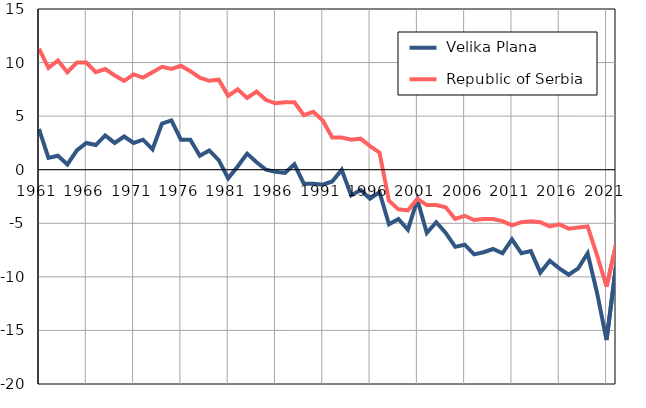
| Category |  Velika Plana |  Republic of Serbia |
|---|---|---|
| 1961.0 | 3.8 | 11.3 |
| 1962.0 | 1.1 | 9.5 |
| 1963.0 | 1.3 | 10.2 |
| 1964.0 | 0.5 | 9.1 |
| 1965.0 | 1.8 | 10 |
| 1966.0 | 2.5 | 10 |
| 1967.0 | 2.3 | 9.1 |
| 1968.0 | 3.2 | 9.4 |
| 1969.0 | 2.5 | 8.8 |
| 1970.0 | 3.1 | 8.3 |
| 1971.0 | 2.5 | 8.9 |
| 1972.0 | 2.8 | 8.6 |
| 1973.0 | 1.9 | 9.1 |
| 1974.0 | 4.3 | 9.6 |
| 1975.0 | 4.6 | 9.4 |
| 1976.0 | 2.8 | 9.7 |
| 1977.0 | 2.8 | 9.2 |
| 1978.0 | 1.3 | 8.6 |
| 1979.0 | 1.8 | 8.3 |
| 1980.0 | 0.9 | 8.4 |
| 1981.0 | -0.8 | 6.9 |
| 1982.0 | 0.3 | 7.5 |
| 1983.0 | 1.5 | 6.7 |
| 1984.0 | 0.7 | 7.3 |
| 1985.0 | 0 | 6.5 |
| 1986.0 | -0.2 | 6.2 |
| 1987.0 | -0.3 | 6.3 |
| 1988.0 | 0.5 | 6.3 |
| 1989.0 | -1.3 | 5.1 |
| 1990.0 | -1.3 | 5.4 |
| 1991.0 | -1.4 | 4.6 |
| 1992.0 | -1.1 | 3 |
| 1993.0 | 0 | 3 |
| 1994.0 | -2.4 | 2.8 |
| 1995.0 | -1.9 | 2.9 |
| 1996.0 | -2.7 | 2.2 |
| 1997.0 | -2.1 | 1.6 |
| 1998.0 | -5.1 | -2.9 |
| 1999.0 | -4.6 | -3.7 |
| 2000.0 | -5.6 | -3.8 |
| 2001.0 | -2.8 | -2.7 |
| 2002.0 | -5.9 | -3.3 |
| 2003.0 | -4.9 | -3.3 |
| 2004.0 | -5.9 | -3.5 |
| 2005.0 | -7.2 | -4.6 |
| 2006.0 | -7 | -4.3 |
| 2007.0 | -7.9 | -4.7 |
| 2008.0 | -7.7 | -4.6 |
| 2009.0 | -7.4 | -4.6 |
| 2010.0 | -7.8 | -4.8 |
| 2011.0 | -6.5 | -5.2 |
| 2012.0 | -7.8 | -4.9 |
| 2013.0 | -7.6 | -4.8 |
| 2014.0 | -9.6 | -4.9 |
| 2015.0 | -8.5 | -5.3 |
| 2016.0 | -9.2 | -5.1 |
| 2017.0 | -9.8 | -5.5 |
| 2018.0 | -9.2 | -5.4 |
| 2019.0 | -7.8 | -5.3 |
| 2020.0 | -11.5 | -8 |
| 2021.0 | -15.9 | -10.9 |
| 2022.0 | -9 | -7 |